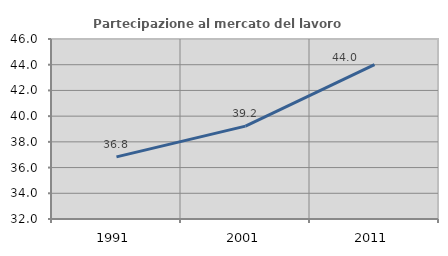
| Category | Partecipazione al mercato del lavoro  femminile |
|---|---|
| 1991.0 | 36.832 |
| 2001.0 | 39.221 |
| 2011.0 | 44.005 |